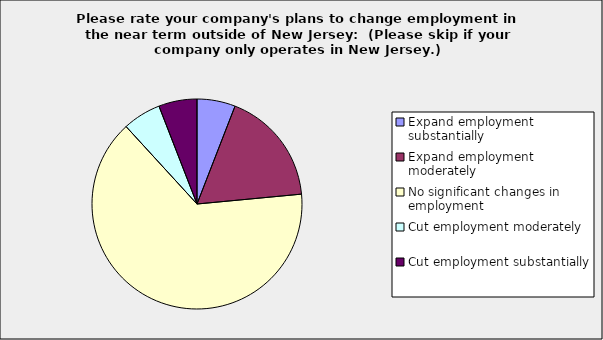
| Category | Series 0 |
|---|---|
| Expand employment substantially | 0.059 |
| Expand employment moderately | 0.176 |
| No significant changes in employment | 0.647 |
| Cut employment moderately | 0.059 |
| Cut employment substantially | 0.059 |